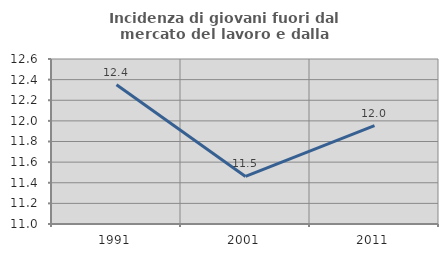
| Category | Incidenza di giovani fuori dal mercato del lavoro e dalla formazione  |
|---|---|
| 1991.0 | 12.351 |
| 2001.0 | 11.461 |
| 2011.0 | 11.953 |